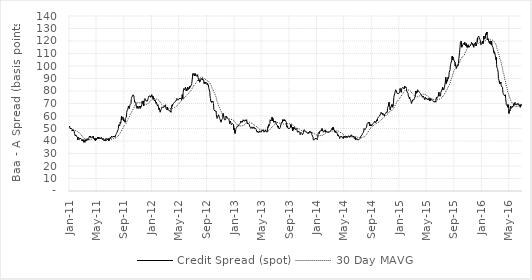
| Category | Credit Spread (spot) |  30 Day MAVG  |
|---|---|---|
| 2016-06-30 | 68 | 68.903 |
| 2016-06-29 | 69 | 68.903 |
| 2016-06-28 | 69 | 68.839 |
| 2016-06-27 | 69 | 68.742 |
| 2016-06-24 | 69 | 68.645 |
| 2016-06-23 | 67 | 68.613 |
| 2016-06-22 | 68 | 68.613 |
| 2016-06-21 | 69 | 68.484 |
| 2016-06-20 | 68 | 68.355 |
| 2016-06-17 | 69 | 68.226 |
| 2016-06-16 | 69 | 68 |
| 2016-06-15 | 69 | 67.839 |
| 2016-06-14 | 70 | 67.839 |
| 2016-06-13 | 69 | 67.742 |
| 2016-06-10 | 69 | 67.742 |
| 2016-06-09 | 70 | 67.71 |
| 2016-06-08 | 70 | 67.645 |
| 2016-06-07 | 69 | 67.581 |
| 2016-06-06 | 69 | 67.581 |
| 2016-06-03 | 69 | 67.645 |
| 2016-06-02 | 69 | 67.71 |
| 2016-06-01 | 70 | 67.871 |
| 2016-05-31 | 71 | 68.097 |
| 2016-05-27 | 69 | 68.258 |
| 2016-05-26 | 70 | 68.484 |
| 2016-05-25 | 69 | 68.677 |
| 2016-05-24 | 69 | 68.903 |
| 2016-05-23 | 68 | 69.129 |
| 2016-05-20 | 67 | 69.452 |
| 2016-05-19 | 68 | 69.839 |
| 2016-05-18 | 68 | 70.258 |
| 2016-05-17 | 68 | 70.742 |
| 2016-05-16 | 67 | 71.226 |
| 2016-05-13 | 66 | 71.742 |
| 2016-05-12 | 66 | 72.323 |
| 2016-05-11 | 68 | 72.935 |
| 2016-05-10 | 67 | 73.548 |
| 2016-05-09 | 64 | 74.161 |
| 2016-05-06 | 65 | 74.903 |
| 2016-05-05 | 64 | 75.581 |
| 2016-05-04 | 62 | 76.355 |
| 2016-05-03 | 64 | 77.194 |
| 2016-05-02 | 69 | 78.032 |
| 2016-04-29 | 67 | 78.871 |
| 2016-04-28 | 69 | 79.806 |
| 2016-04-27 | 68 | 80.71 |
| 2016-04-26 | 68 | 81.677 |
| 2016-04-25 | 68 | 82.677 |
| 2016-04-22 | 69 | 83.742 |
| 2016-04-21 | 71 | 84.968 |
| 2016-04-20 | 71 | 86.065 |
| 2016-04-19 | 74 | 87.194 |
| 2016-04-18 | 77 | 88.29 |
| 2016-04-15 | 76 | 89.355 |
| 2016-04-14 | 76 | 90.452 |
| 2016-04-13 | 76 | 91.581 |
| 2016-04-12 | 76 | 92.677 |
| 2016-04-11 | 76 | 93.774 |
| 2016-04-08 | 78 | 94.968 |
| 2016-04-07 | 79 | 96.097 |
| 2016-04-06 | 81 | 97.258 |
| 2016-04-05 | 83 | 98.355 |
| 2016-04-04 | 83 | 99.419 |
| 2016-04-01 | 83 | 100.548 |
| 2016-03-31 | 84 | 101.742 |
| 2016-03-30 | 85 | 102.806 |
| 2016-03-29 | 87 | 103.839 |
| 2016-03-28 | 86 | 104.871 |
| 2016-03-24 | 87 | 105.968 |
| 2016-03-23 | 86 | 106.968 |
| 2016-03-22 | 88 | 108 |
| 2016-03-21 | 88 | 109 |
| 2016-03-18 | 90 | 110.032 |
| 2016-03-17 | 95 | 111 |
| 2016-03-16 | 96 | 111.806 |
| 2016-03-15 | 97 | 112.645 |
| 2016-03-14 | 98 | 113.419 |
| 2016-03-11 | 99 | 114.355 |
| 2016-03-10 | 101 | 115.226 |
| 2016-03-09 | 107 | 116.065 |
| 2016-03-08 | 105 | 116.645 |
| 2016-03-07 | 106 | 117.323 |
| 2016-03-04 | 108 | 117.903 |
| 2016-03-03 | 110 | 118.355 |
| 2016-03-02 | 110 | 118.742 |
| 2016-03-01 | 111 | 119.129 |
| 2016-02-29 | 110 | 119.548 |
| 2016-02-26 | 110 | 119.903 |
| 2016-02-25 | 113 | 120.194 |
| 2016-02-24 | 113 | 120.355 |
| 2016-02-23 | 115 | 120.581 |
| 2016-02-22 | 115 | 120.742 |
| 2016-02-19 | 116 | 120.839 |
| 2016-02-18 | 118 | 120.903 |
| 2016-02-17 | 120 | 120.903 |
| 2016-02-16 | 117 | 120.806 |
| 2016-02-12 | 117 | 120.871 |
| 2016-02-11 | 119 | 120.968 |
| 2016-02-10 | 120 | 121.032 |
| 2016-02-09 | 118 | 121.065 |
| 2016-02-08 | 118 | 121.226 |
| 2016-02-05 | 119 | 121.419 |
| 2016-02-04 | 120 | 121.581 |
| 2016-02-03 | 120 | 121.677 |
| 2016-02-02 | 120 | 121.71 |
| 2016-02-01 | 122 | 121.774 |
| 2016-01-29 | 121 | 121.677 |
| 2016-01-28 | 127 | 121.613 |
| 2016-01-27 | 126 | 121.355 |
| 2016-01-26 | 127 | 121.032 |
| 2016-01-25 | 125 | 120.71 |
| 2016-01-22 | 126 | 120.516 |
| 2016-01-21 | 124 | 120.258 |
| 2016-01-20 | 122 | 120.032 |
| 2016-01-19 | 122 | 119.903 |
| 2016-01-15 | 122 | 119.774 |
| 2016-01-14 | 124 | 119.613 |
| 2016-01-13 | 121 | 119.323 |
| 2016-01-12 | 119 | 119.194 |
| 2016-01-11 | 118 | 119.161 |
| 2016-01-08 | 120 | 119.129 |
| 2016-01-07 | 120 | 119.032 |
| 2016-01-06 | 118 | 119 |
| 2016-01-05 | 118 | 119 |
| 2016-01-04 | 118 | 119 |
| 2015-12-31 | 117 | 118.968 |
| 2015-12-30 | 119 | 118.968 |
| 2015-12-29 | 120 | 118.871 |
| 2015-12-28 | 121 | 118.742 |
| 2015-12-24 | 121 | 118.581 |
| 2015-12-23 | 123 | 118.387 |
| 2015-12-22 | 124 | 118.161 |
| 2015-12-21 | 124 | 117.935 |
| 2015-12-18 | 123 | 117.677 |
| 2015-12-17 | 121 | 117.419 |
| 2015-12-16 | 122 | 117.258 |
| 2015-12-15 | 119 | 117.032 |
| 2015-12-14 | 119 | 116.968 |
| 2015-12-11 | 119 | 116.935 |
| 2015-12-10 | 116 | 116.903 |
| 2015-12-09 | 117 | 116.903 |
| 2015-12-08 | 119 | 116.903 |
| 2015-12-07 | 118 | 116.839 |
| 2015-12-04 | 117 | 116.871 |
| 2015-12-03 | 118 | 116.871 |
| 2015-12-02 | 118 | 116.871 |
| 2015-12-01 | 117 | 116.871 |
| 2015-11-30 | 115 | 116.903 |
| 2015-11-27 | 117 | 117 |
| 2015-11-25 | 118 | 117 |
| 2015-11-24 | 117 | 116.935 |
| 2015-11-23 | 117 | 116.871 |
| 2015-11-20 | 119 | 116.806 |
| 2015-11-19 | 118 | 116.806 |
| 2015-11-18 | 118 | 116.871 |
| 2015-11-17 | 117 | 116.903 |
| 2015-11-16 | 117 | 116.968 |
| 2015-11-13 | 116 | 116.903 |
| 2015-11-12 | 116 | 116.806 |
| 2015-11-10 | 116 | 116.645 |
| 2015-11-09 | 115 | 116.323 |
| 2015-11-06 | 116 | 115.968 |
| 2015-11-05 | 117 | 115.516 |
| 2015-11-04 | 116 | 115 |
| 2015-11-03 | 115 | 114.484 |
| 2015-11-02 | 116 | 114.032 |
| 2015-10-30 | 115 | 113.516 |
| 2015-10-29 | 117 | 113.032 |
| 2015-10-28 | 118 | 112.484 |
| 2015-10-27 | 118 | 111.839 |
| 2015-10-26 | 116 | 111.258 |
| 2015-10-23 | 117 | 110.774 |
| 2015-10-22 | 117 | 110.226 |
| 2015-10-21 | 119 | 109.774 |
| 2015-10-20 | 117 | 109.29 |
| 2015-10-19 | 118 | 108.871 |
| 2015-10-16 | 118 | 108.419 |
| 2015-10-15 | 118 | 108.032 |
| 2015-10-14 | 118 | 107.677 |
| 2015-10-13 | 117 | 107.258 |
| 2015-10-09 | 116 | 106.968 |
| 2015-10-08 | 115 | 106.71 |
| 2015-10-07 | 115 | 106.419 |
| 2015-10-06 | 119 | 106.065 |
| 2015-10-05 | 120 | 105.581 |
| 2015-10-02 | 119 | 105 |
| 2015-10-01 | 119 | 104.419 |
| 2015-09-30 | 115 | 103.806 |
| 2015-09-29 | 113 | 103.226 |
| 2015-09-28 | 111 | 102.71 |
| 2015-09-25 | 106 | 102.194 |
| 2015-09-24 | 104 | 101.742 |
| 2015-09-23 | 102 | 101.355 |
| 2015-09-22 | 101 | 100.968 |
| 2015-09-21 | 100 | 100.645 |
| 2015-09-18 | 101 | 100.258 |
| 2015-09-17 | 100 | 99.871 |
| 2015-09-16 | 100 | 99.516 |
| 2015-09-15 | 100 | 99.161 |
| 2015-09-14 | 98 | 98.71 |
| 2015-09-11 | 100 | 98.419 |
| 2015-09-10 | 101 | 98.129 |
| 2015-09-09 | 100 | 97.806 |
| 2015-09-08 | 103 | 97.387 |
| 2015-09-04 | 104 | 96.774 |
| 2015-09-03 | 104 | 96.097 |
| 2015-09-02 | 104 | 95.387 |
| 2015-09-01 | 106 | 94.677 |
| 2015-08-31 | 107 | 93.871 |
| 2015-08-28 | 105 | 93.065 |
| 2015-08-27 | 108 | 92.29 |
| 2015-08-26 | 108 | 91.484 |
| 2015-08-25 | 106 | 90.645 |
| 2015-08-24 | 104 | 89.871 |
| 2015-08-21 | 104 | 89.097 |
| 2015-08-20 | 102 | 88.323 |
| 2015-08-19 | 101 | 87.613 |
| 2015-08-18 | 100 | 86.903 |
| 2015-08-17 | 97 | 86.129 |
| 2015-08-14 | 97 | 85.452 |
| 2015-08-13 | 95 | 84.774 |
| 2015-08-12 | 92 | 84.194 |
| 2015-08-11 | 92 | 83.774 |
| 2015-08-10 | 90 | 83.258 |
| 2015-08-07 | 91 | 82.806 |
| 2015-08-06 | 88 | 82.323 |
| 2015-08-05 | 89 | 81.935 |
| 2015-08-04 | 89 | 81.484 |
| 2015-08-03 | 89 | 81 |
| 2015-07-31 | 86 | 80.548 |
| 2015-07-30 | 89 | 80.161 |
| 2015-07-29 | 91 | 79.645 |
| 2015-07-28 | 91 | 79 |
| 2015-07-27 | 87 | 78.387 |
| 2015-07-24 | 84 | 77.903 |
| 2015-07-23 | 83 | 77.516 |
| 2015-07-22 | 82 | 77.161 |
| 2015-07-21 | 82 | 76.806 |
| 2015-07-20 | 81 | 76.452 |
| 2015-07-17 | 82 | 76.161 |
| 2015-07-16 | 81 | 75.839 |
| 2015-07-15 | 83 | 75.548 |
| 2015-07-14 | 82 | 75.194 |
| 2015-07-13 | 82 | 74.903 |
| 2015-07-10 | 80 | 74.613 |
| 2015-07-09 | 80 | 74.387 |
| 2015-07-08 | 80 | 74.161 |
| 2015-07-07 | 79 | 73.935 |
| 2015-07-06 | 76 | 73.774 |
| 2015-07-02 | 76 | 73.645 |
| 2015-07-01 | 76 | 73.581 |
| 2015-06-30 | 77 | 73.516 |
| 2015-06-29 | 79 | 73.419 |
| 2015-06-26 | 76 | 73.226 |
| 2015-06-25 | 76 | 73.161 |
| 2015-06-24 | 76 | 73.097 |
| 2015-06-23 | 76 | 73.032 |
| 2015-06-22 | 75 | 72.935 |
| 2015-06-19 | 74 | 72.903 |
| 2015-06-18 | 75 | 72.903 |
| 2015-06-17 | 74 | 72.871 |
| 2015-06-16 | 73 | 72.871 |
| 2015-06-15 | 71 | 72.903 |
| 2015-06-12 | 72 | 73 |
| 2015-06-11 | 72 | 73.097 |
| 2015-06-10 | 72 | 73.161 |
| 2015-06-09 | 72 | 73.194 |
| 2015-06-08 | 71 | 73.226 |
| 2015-06-05 | 71 | 73.29 |
| 2015-06-04 | 72 | 73.419 |
| 2015-06-03 | 72 | 73.516 |
| 2015-06-02 | 72 | 73.645 |
| 2015-06-01 | 72 | 73.774 |
| 2015-05-29 | 73 | 73.871 |
| 2015-05-28 | 73 | 73.968 |
| 2015-05-27 | 73 | 74.065 |
| 2015-05-26 | 73 | 74.161 |
| 2015-05-22 | 73 | 74.29 |
| 2015-05-21 | 74 | 74.419 |
| 2015-05-20 | 72 | 74.548 |
| 2015-05-19 | 74 | 74.742 |
| 2015-05-18 | 74 | 74.871 |
| 2015-05-15 | 74 | 75.032 |
| 2015-05-14 | 73 | 75.194 |
| 2015-05-13 | 74 | 75.387 |
| 2015-05-12 | 74 | 75.548 |
| 2015-05-11 | 74 | 75.742 |
| 2015-05-08 | 73 | 75.935 |
| 2015-05-07 | 74 | 76.194 |
| 2015-05-06 | 74 | 76.355 |
| 2015-05-05 | 74 | 76.548 |
| 2015-05-04 | 74 | 76.742 |
| 2015-05-01 | 74 | 76.871 |
| 2015-04-30 | 74 | 77.032 |
| 2015-04-29 | 75 | 77.226 |
| 2015-04-28 | 74 | 77.355 |
| 2015-04-27 | 73 | 77.419 |
| 2015-04-24 | 73 | 77.516 |
| 2015-04-23 | 73 | 77.548 |
| 2015-04-22 | 75 | 77.581 |
| 2015-04-21 | 75 | 77.516 |
| 2015-04-20 | 76 | 77.452 |
| 2015-04-17 | 76 | 77.355 |
| 2015-04-16 | 75 | 77.258 |
| 2015-04-15 | 76 | 77.194 |
| 2015-04-14 | 76 | 77.097 |
| 2015-04-13 | 76 | 77 |
| 2015-04-10 | 77 | 76.806 |
| 2015-04-09 | 77 | 76.613 |
| 2015-04-08 | 78 | 76.452 |
| 2015-04-07 | 78 | 76.258 |
| 2015-04-06 | 78 | 76.097 |
| 2015-04-03 | 79 | 75.968 |
| 2015-04-02 | 79 | 75.839 |
| 2015-04-01 | 79 | 75.677 |
| 2015-03-31 | 79 | 75.548 |
| 2015-03-30 | 80 | 75.452 |
| 2015-03-27 | 80 | 75.387 |
| 2015-03-26 | 81 | 75.323 |
| 2015-03-25 | 79 | 75.226 |
| 2015-03-24 | 80 | 75.226 |
| 2015-03-23 | 80 | 75.226 |
| 2015-03-20 | 78 | 75.29 |
| 2015-03-19 | 79 | 75.452 |
| 2015-03-18 | 80 | 75.581 |
| 2015-03-17 | 79 | 75.677 |
| 2015-03-16 | 76 | 75.806 |
| 2015-03-13 | 76 | 76.032 |
| 2015-03-12 | 74 | 76.29 |
| 2015-03-11 | 74 | 76.548 |
| 2015-03-10 | 73 | 76.806 |
| 2015-03-09 | 73 | 77.097 |
| 2015-03-06 | 73 | 77.387 |
| 2015-03-05 | 73 | 77.677 |
| 2015-03-04 | 73 | 78 |
| 2015-03-03 | 73 | 78.323 |
| 2015-03-02 | 73 | 78.613 |
| 2015-02-27 | 70 | 78.839 |
| 2015-02-26 | 71 | 79.129 |
| 2015-02-25 | 72 | 79.419 |
| 2015-02-24 | 72 | 79.71 |
| 2015-02-23 | 73 | 80.032 |
| 2015-02-20 | 74 | 80.29 |
| 2015-02-19 | 75 | 80.452 |
| 2015-02-18 | 74 | 80.581 |
| 2015-02-17 | 75 | 80.71 |
| 2015-02-13 | 76 | 80.806 |
| 2015-02-12 | 78 | 80.871 |
| 2015-02-11 | 78 | 80.871 |
| 2015-02-10 | 78 | 80.871 |
| 2015-02-09 | 79 | 80.871 |
| 2015-02-06 | 80 | 80.839 |
| 2015-02-05 | 82 | 80.839 |
| 2015-02-04 | 83 | 80.806 |
| 2015-02-03 | 83 | 80.742 |
| 2015-02-02 | 83 | 80.677 |
| 2015-01-30 | 83 | 80.613 |
| 2015-01-29 | 83 | 80.452 |
| 2015-01-28 | 84 | 80.226 |
| 2015-01-27 | 82 | 79.935 |
| 2015-01-26 | 82 | 79.613 |
| 2015-01-23 | 82 | 79.226 |
| 2015-01-22 | 82 | 78.774 |
| 2015-01-21 | 82 | 78.29 |
| 2015-01-20 | 83 | 77.871 |
| 2015-01-16 | 83 | 77.387 |
| 2015-01-15 | 82 | 76.935 |
| 2015-01-14 | 80 | 76.484 |
| 2015-01-13 | 79 | 76.065 |
| 2015-01-12 | 80 | 75.645 |
| 2015-01-09 | 81 | 75.161 |
| 2015-01-08 | 82 | 74.71 |
| 2015-01-07 | 81 | 74.29 |
| 2015-01-06 | 79 | 73.968 |
| 2015-01-05 | 79 | 73.71 |
| 2015-01-02 | 78 | 73.452 |
| 2014-12-31 | 78 | 73.129 |
| 2014-12-30 | 78 | 72.774 |
| 2014-12-29 | 78 | 72.387 |
| 2014-12-26 | 78 | 71.903 |
| 2014-12-24 | 78 | 71.419 |
| 2014-12-23 | 78 | 70.935 |
| 2014-12-22 | 80 | 70.452 |
| 2014-12-19 | 81 | 69.903 |
| 2014-12-18 | 81 | 69.29 |
| 2014-12-17 | 81 | 68.677 |
| 2014-12-16 | 81 | 68.065 |
| 2014-12-15 | 78 | 67.419 |
| 2014-12-12 | 76 | 66.839 |
| 2014-12-11 | 75 | 66.355 |
| 2014-12-10 | 72 | 65.903 |
| 2014-12-09 | 70 | 65.548 |
| 2014-12-08 | 68 | 65.29 |
| 2014-12-05 | 67 | 65.065 |
| 2014-12-04 | 69 | 64.903 |
| 2014-12-03 | 68 | 64.677 |
| 2014-12-02 | 69 | 64.484 |
| 2014-12-01 | 68 | 64.258 |
| 2014-11-28 | 67 | 64.097 |
| 2014-11-26 | 66 | 63.968 |
| 2014-11-25 | 65 | 63.839 |
| 2014-11-24 | 67 | 63.742 |
| 2014-11-21 | 69 | 63.516 |
| 2014-11-20 | 71 | 63.226 |
| 2014-11-19 | 71 | 62.871 |
| 2014-11-18 | 71 | 62.516 |
| 2014-11-17 | 68 | 62.129 |
| 2014-11-14 | 67 | 61.839 |
| 2014-11-13 | 66 | 61.581 |
| 2014-11-12 | 63 | 61.323 |
| 2014-11-11 | 63 | 61.097 |
| 2014-11-10 | 63 | 60.903 |
| 2014-11-07 | 63 | 60.677 |
| 2014-11-06 | 63 | 60.452 |
| 2014-11-05 | 62 | 60.194 |
| 2014-11-04 | 62 | 59.968 |
| 2014-11-03 | 62 | 59.742 |
| 2014-10-31 | 61 | 59.516 |
| 2014-10-30 | 60 | 59.355 |
| 2014-10-29 | 61 | 59.226 |
| 2014-10-28 | 61 | 59.032 |
| 2014-10-27 | 61 | 58.839 |
| 2014-10-24 | 62 | 58.613 |
| 2014-10-23 | 61 | 58.355 |
| 2014-10-22 | 62 | 58.129 |
| 2014-10-21 | 62 | 57.871 |
| 2014-10-20 | 62 | 57.581 |
| 2014-10-17 | 62 | 57.258 |
| 2014-10-16 | 63 | 56.935 |
| 2014-10-15 | 63 | 56.613 |
| 2014-10-14 | 62 | 56.258 |
| 2014-10-10 | 62 | 55.968 |
| 2014-10-09 | 60 | 55.645 |
| 2014-10-08 | 60 | 55.452 |
| 2014-10-07 | 60 | 55.29 |
| 2014-10-06 | 60 | 55.097 |
| 2014-10-03 | 59 | 54.903 |
| 2014-10-02 | 59 | 54.774 |
| 2014-10-01 | 59 | 54.645 |
| 2014-09-30 | 58 | 54.516 |
| 2014-09-29 | 56 | 54.387 |
| 2014-09-26 | 57 | 54.29 |
| 2014-09-25 | 56 | 54.129 |
| 2014-09-24 | 56 | 53.968 |
| 2014-09-23 | 55 | 53.806 |
| 2014-09-22 | 55 | 53.677 |
| 2014-09-19 | 55 | 53.516 |
| 2014-09-18 | 55 | 53.355 |
| 2014-09-17 | 56 | 53.161 |
| 2014-09-16 | 56 | 52.935 |
| 2014-09-15 | 55 | 52.742 |
| 2014-09-12 | 55 | 52.516 |
| 2014-09-11 | 54 | 52.258 |
| 2014-09-10 | 54 | 52.032 |
| 2014-09-09 | 54 | 51.806 |
| 2014-09-08 | 54 | 51.548 |
| 2014-09-05 | 53 | 51.258 |
| 2014-09-04 | 52 | 51 |
| 2014-09-03 | 52 | 50.774 |
| 2014-09-02 | 53 | 50.548 |
| 2014-08-29 | 52 | 50.258 |
| 2014-08-28 | 53 | 49.968 |
| 2014-08-27 | 52 | 49.645 |
| 2014-08-26 | 54 | 49.355 |
| 2014-08-25 | 55 | 48.968 |
| 2014-08-22 | 54 | 48.548 |
| 2014-08-21 | 54 | 48.161 |
| 2014-08-20 | 55 | 47.742 |
| 2014-08-19 | 55 | 47.29 |
| 2014-08-18 | 55 | 46.839 |
| 2014-08-15 | 54 | 46.387 |
| 2014-08-14 | 53 | 45.968 |
| 2014-08-13 | 52 | 45.581 |
| 2014-08-12 | 51 | 45.258 |
| 2014-08-11 | 51 | 44.968 |
| 2014-08-08 | 51 | 44.645 |
| 2014-08-07 | 50 | 44.355 |
| 2014-08-06 | 50 | 44.065 |
| 2014-08-05 | 49 | 43.839 |
| 2014-08-04 | 49 | 43.645 |
| 2014-08-01 | 50 | 43.419 |
| 2014-07-31 | 48 | 43.194 |
| 2014-07-30 | 47 | 43.065 |
| 2014-07-29 | 47 | 42.968 |
| 2014-07-28 | 47 | 42.839 |
| 2014-07-25 | 46 | 42.742 |
| 2014-07-24 | 45 | 42.677 |
| 2014-07-23 | 45 | 42.645 |
| 2014-07-22 | 45 | 42.613 |
| 2014-07-21 | 45 | 42.581 |
| 2014-07-18 | 44 | 42.581 |
| 2014-07-17 | 43 | 42.613 |
| 2014-07-16 | 43 | 42.645 |
| 2014-07-15 | 43 | 42.677 |
| 2014-07-14 | 42 | 42.677 |
| 2014-07-11 | 42 | 42.71 |
| 2014-07-10 | 42 | 42.742 |
| 2014-07-09 | 41 | 42.806 |
| 2014-07-08 | 41 | 42.903 |
| 2014-07-07 | 41 | 43 |
| 2014-07-03 | 41 | 43.065 |
| 2014-07-02 | 41 | 43.129 |
| 2014-07-01 | 41 | 43.194 |
| 2014-06-30 | 42 | 43.258 |
| 2014-06-27 | 42 | 43.323 |
| 2014-06-26 | 41 | 43.355 |
| 2014-06-25 | 42 | 43.419 |
| 2014-06-24 | 41 | 43.452 |
| 2014-06-23 | 43 | 43.516 |
| 2014-06-20 | 43 | 43.516 |
| 2014-06-19 | 42 | 43.548 |
| 2014-06-18 | 43 | 43.581 |
| 2014-06-17 | 44 | 43.613 |
| 2014-06-16 | 44 | 43.581 |
| 2014-06-13 | 43 | 43.516 |
| 2014-06-12 | 44 | 43.516 |
| 2014-06-11 | 44 | 43.484 |
| 2014-06-10 | 44 | 43.452 |
| 2014-06-09 | 44 | 43.419 |
| 2014-06-06 | 44 | 43.387 |
| 2014-06-05 | 45 | 43.355 |
| 2014-06-04 | 45 | 43.29 |
| 2014-06-03 | 44 | 43.258 |
| 2014-06-02 | 44 | 43.226 |
| 2014-05-30 | 43 | 43.194 |
| 2014-05-29 | 43 | 43.161 |
| 2014-05-28 | 43 | 43.161 |
| 2014-05-27 | 44 | 43.194 |
| 2014-05-23 | 44 | 43.194 |
| 2014-05-22 | 44 | 43.226 |
| 2014-05-21 | 43 | 43.226 |
| 2014-05-20 | 43 | 43.258 |
| 2014-05-19 | 43 | 43.355 |
| 2014-05-16 | 43 | 43.484 |
| 2014-05-15 | 44 | 43.613 |
| 2014-05-14 | 43 | 43.71 |
| 2014-05-13 | 43 | 43.839 |
| 2014-05-12 | 43 | 43.968 |
| 2014-05-09 | 43 | 44.129 |
| 2014-05-08 | 43 | 44.258 |
| 2014-05-07 | 44 | 44.419 |
| 2014-05-06 | 43 | 44.548 |
| 2014-05-05 | 44 | 44.742 |
| 2014-05-02 | 43 | 44.903 |
| 2014-05-01 | 42 | 45.129 |
| 2014-04-30 | 43 | 45.355 |
| 2014-04-29 | 43 | 45.613 |
| 2014-04-28 | 43 | 45.806 |
| 2014-04-25 | 43 | 46 |
| 2014-04-24 | 43 | 46.194 |
| 2014-04-23 | 43 | 46.419 |
| 2014-04-22 | 43 | 46.613 |
| 2014-04-21 | 44 | 46.806 |
| 2014-04-17 | 43 | 46.968 |
| 2014-04-16 | 43 | 47.129 |
| 2014-04-15 | 42 | 47.29 |
| 2014-04-14 | 43 | 47.484 |
| 2014-04-11 | 44 | 47.613 |
| 2014-04-10 | 44 | 47.71 |
| 2014-04-09 | 45 | 47.806 |
| 2014-04-08 | 44 | 47.871 |
| 2014-04-07 | 44 | 47.968 |
| 2014-04-04 | 46 | 48.065 |
| 2014-04-03 | 47 | 48.097 |
| 2014-04-02 | 47 | 48.097 |
| 2014-04-01 | 47 | 48.097 |
| 2014-03-31 | 47 | 48.129 |
| 2014-03-28 | 47 | 48.129 |
| 2014-03-27 | 48 | 48.129 |
| 2014-03-26 | 47 | 48.129 |
| 2014-03-25 | 48 | 48.194 |
| 2014-03-24 | 48 | 48.194 |
| 2014-03-21 | 49 | 48.194 |
| 2014-03-20 | 49 | 48.161 |
| 2014-03-19 | 50 | 48.129 |
| 2014-03-18 | 49 | 48.032 |
| 2014-03-17 | 51 | 48 |
| 2014-03-14 | 49 | 47.903 |
| 2014-03-13 | 49 | 47.903 |
| 2014-03-12 | 49 | 47.871 |
| 2014-03-11 | 50 | 47.903 |
| 2014-03-10 | 49 | 47.871 |
| 2014-03-07 | 49 | 47.839 |
| 2014-03-06 | 49 | 47.806 |
| 2014-03-05 | 48 | 47.774 |
| 2014-03-04 | 48 | 47.774 |
| 2014-03-03 | 48 | 47.742 |
| 2014-02-28 | 47 | 47.677 |
| 2014-02-27 | 47 | 47.677 |
| 2014-02-26 | 47 | 47.677 |
| 2014-02-25 | 47 | 47.645 |
| 2014-02-24 | 47 | 47.581 |
| 2014-02-21 | 47 | 47.452 |
| 2014-02-20 | 47 | 47.29 |
| 2014-02-19 | 47 | 47.097 |
| 2014-02-18 | 47 | 46.935 |
| 2014-02-14 | 48 | 46.774 |
| 2014-02-13 | 47 | 46.581 |
| 2014-02-12 | 47 | 46.419 |
| 2014-02-11 | 48 | 46.258 |
| 2014-02-10 | 49 | 46.065 |
| 2014-02-07 | 48 | 45.806 |
| 2014-02-06 | 48 | 45.581 |
| 2014-02-05 | 48 | 45.355 |
| 2014-02-04 | 48 | 45.129 |
| 2014-02-03 | 47 | 44.968 |
| 2014-01-31 | 48 | 44.839 |
| 2014-01-30 | 48 | 44.71 |
| 2014-01-29 | 49 | 44.613 |
| 2014-01-28 | 48 | 44.548 |
| 2014-01-27 | 50 | 44.516 |
| 2014-01-24 | 49 | 44.419 |
| 2014-01-23 | 48 | 44.355 |
| 2014-01-22 | 48 | 44.323 |
| 2014-01-21 | 48 | 44.29 |
| 2014-01-17 | 48 | 44.29 |
| 2014-01-16 | 47 | 44.258 |
| 2014-01-15 | 46 | 44.258 |
| 2014-01-14 | 47 | 44.258 |
| 2014-01-13 | 47 | 44.258 |
| 2014-01-10 | 46 | 44.258 |
| 2014-01-09 | 45 | 44.258 |
| 2014-01-08 | 43 | 44.29 |
| 2014-01-07 | 42 | 44.387 |
| 2014-01-06 | 41 | 44.548 |
| 2014-01-03 | 42 | 44.742 |
| 2014-01-02 | 42 | 44.903 |
| 2013-12-31 | 42 | 45.097 |
| 2013-12-30 | 42 | 45.29 |
| 2013-12-27 | 42 | 45.484 |
| 2013-12-26 | 42 | 45.677 |
| 2013-12-24 | 41 | 45.903 |
| 2013-12-23 | 41 | 46.129 |
| 2013-12-20 | 41 | 46.323 |
| 2013-12-19 | 41 | 46.484 |
| 2013-12-18 | 43 | 46.645 |
| 2013-12-17 | 43 | 46.71 |
| 2013-12-16 | 44 | 46.774 |
| 2013-12-13 | 45 | 46.839 |
| 2013-12-12 | 47 | 46.871 |
| 2013-12-11 | 47 | 46.839 |
| 2013-12-10 | 47 | 46.839 |
| 2013-12-09 | 47 | 46.806 |
| 2013-12-06 | 47 | 46.774 |
| 2013-12-05 | 47 | 46.71 |
| 2013-12-04 | 48 | 46.677 |
| 2013-12-03 | 47 | 46.645 |
| 2013-12-02 | 47 | 46.645 |
| 2013-11-29 | 46 | 46.677 |
| 2013-11-27 | 47 | 46.742 |
| 2013-11-26 | 47 | 46.742 |
| 2013-11-25 | 46 | 46.742 |
| 2013-11-22 | 46 | 46.806 |
| 2013-11-21 | 46 | 46.903 |
| 2013-11-20 | 47 | 47.032 |
| 2013-11-19 | 47 | 47.129 |
| 2013-11-18 | 47 | 47.226 |
| 2013-11-15 | 48 | 47.29 |
| 2013-11-14 | 48 | 47.355 |
| 2013-11-13 | 48 | 47.419 |
| 2013-11-12 | 48 | 47.484 |
| 2013-11-08 | 49 | 47.548 |
| 2013-11-07 | 48 | 47.613 |
| 2013-11-06 | 47 | 47.677 |
| 2013-11-05 | 46 | 47.742 |
| 2013-11-04 | 46 | 47.903 |
| 2013-11-01 | 45 | 47.968 |
| 2013-10-31 | 45 | 48.097 |
| 2013-10-30 | 46 | 48.258 |
| 2013-10-29 | 46 | 48.387 |
| 2013-10-28 | 46 | 48.581 |
| 2013-10-25 | 47 | 48.806 |
| 2013-10-24 | 46 | 48.968 |
| 2013-10-23 | 46 | 49.194 |
| 2013-10-22 | 45 | 49.355 |
| 2013-10-21 | 46 | 49.548 |
| 2013-10-18 | 47 | 49.677 |
| 2013-10-17 | 47 | 49.774 |
| 2013-10-16 | 48 | 49.871 |
| 2013-10-15 | 48 | 49.935 |
| 2013-10-11 | 47 | 50 |
| 2013-10-10 | 47 | 50.129 |
| 2013-10-09 | 48 | 50.29 |
| 2013-10-08 | 49 | 50.387 |
| 2013-10-07 | 50 | 50.516 |
| 2013-10-04 | 50 | 50.677 |
| 2013-10-03 | 50 | 50.839 |
| 2013-10-02 | 49 | 51 |
| 2013-10-01 | 50 | 51.226 |
| 2013-09-30 | 50 | 51.419 |
| 2013-09-27 | 50 | 51.645 |
| 2013-09-26 | 50 | 51.839 |
| 2013-09-25 | 51 | 52.065 |
| 2013-09-24 | 50 | 52.226 |
| 2013-09-23 | 49 | 52.419 |
| 2013-09-20 | 51 | 52.677 |
| 2013-09-19 | 48 | 52.839 |
| 2013-09-18 | 49 | 53.129 |
| 2013-09-17 | 50 | 53.323 |
| 2013-09-16 | 50 | 53.484 |
| 2013-09-13 | 52 | 53.645 |
| 2013-09-12 | 53 | 53.742 |
| 2013-09-11 | 52 | 53.774 |
| 2013-09-10 | 53 | 53.839 |
| 2013-09-09 | 51 | 53.774 |
| 2013-09-06 | 51 | 53.774 |
| 2013-09-05 | 50 | 53.742 |
| 2013-09-04 | 50 | 53.742 |
| 2013-09-03 | 50 | 53.742 |
| 2013-08-30 | 50 | 53.742 |
| 2013-08-29 | 50 | 53.774 |
| 2013-08-28 | 51 | 53.839 |
| 2013-08-27 | 52 | 53.839 |
| 2013-08-26 | 51 | 53.839 |
| 2013-08-23 | 53 | 53.871 |
| 2013-08-22 | 55 | 53.839 |
| 2013-08-21 | 55 | 53.774 |
| 2013-08-20 | 55 | 53.71 |
| 2013-08-19 | 56 | 53.677 |
| 2013-08-16 | 56 | 53.677 |
| 2013-08-15 | 57 | 53.677 |
| 2013-08-14 | 56 | 53.613 |
| 2013-08-13 | 57 | 53.613 |
| 2013-08-12 | 56 | 53.581 |
| 2013-08-09 | 56 | 53.548 |
| 2013-08-08 | 57 | 53.516 |
| 2013-08-07 | 56 | 53.516 |
| 2013-08-06 | 57 | 53.581 |
| 2013-08-05 | 55 | 53.548 |
| 2013-08-02 | 55 | 53.677 |
| 2013-08-01 | 55 | 53.774 |
| 2013-07-31 | 55 | 53.839 |
| 2013-07-30 | 54 | 53.903 |
| 2013-07-29 | 54 | 53.968 |
| 2013-07-26 | 51 | 54.032 |
| 2013-07-25 | 51 | 54.194 |
| 2013-07-24 | 50 | 54.387 |
| 2013-07-23 | 50 | 54.516 |
| 2013-07-22 | 50 | 54.613 |
| 2013-07-19 | 50 | 54.677 |
| 2013-07-18 | 51 | 54.774 |
| 2013-07-17 | 52 | 54.839 |
| 2013-07-16 | 51 | 54.871 |
| 2013-07-15 | 52 | 54.839 |
| 2013-07-12 | 52 | 54.71 |
| 2013-07-11 | 52 | 54.581 |
| 2013-07-10 | 53 | 54.419 |
| 2013-07-09 | 53 | 54.226 |
| 2013-07-08 | 54 | 54.065 |
| 2013-07-05 | 56 | 53.903 |
| 2013-07-03 | 56 | 53.677 |
| 2013-07-02 | 55 | 53.419 |
| 2013-07-01 | 56 | 53.194 |
| 2013-06-28 | 56 | 52.935 |
| 2013-06-27 | 55 | 52.645 |
| 2013-06-26 | 55 | 52.419 |
| 2013-06-25 | 57 | 52.226 |
| 2013-06-24 | 58 | 51.935 |
| 2013-06-21 | 56 | 51.613 |
| 2013-06-20 | 59 | 51.355 |
| 2013-06-19 | 58 | 51.032 |
| 2013-06-18 | 57 | 50.71 |
| 2013-06-17 | 57 | 50.419 |
| 2013-06-14 | 56 | 50.097 |
| 2013-06-13 | 56 | 49.806 |
| 2013-06-12 | 56 | 49.516 |
| 2013-06-11 | 57 | 49.226 |
| 2013-06-10 | 54 | 48.935 |
| 2013-06-07 | 53 | 48.742 |
| 2013-06-06 | 52 | 48.548 |
| 2013-06-05 | 53 | 48.387 |
| 2013-06-04 | 53 | 48.194 |
| 2013-06-03 | 53 | 48 |
| 2013-05-31 | 50 | 47.806 |
| 2013-05-30 | 48 | 47.742 |
| 2013-05-29 | 48 | 47.742 |
| 2013-05-28 | 47 | 47.71 |
| 2013-05-24 | 47 | 47.742 |
| 2013-05-23 | 48 | 47.806 |
| 2013-05-22 | 49 | 47.839 |
| 2013-05-21 | 49 | 47.839 |
| 2013-05-20 | 48 | 47.871 |
| 2013-05-17 | 48 | 47.935 |
| 2013-05-16 | 48 | 48 |
| 2013-05-15 | 47 | 48.065 |
| 2013-05-14 | 48 | 48.194 |
| 2013-05-13 | 49 | 48.29 |
| 2013-05-10 | 48 | 48.355 |
| 2013-05-09 | 48 | 48.419 |
| 2013-05-08 | 48 | 48.484 |
| 2013-05-07 | 49 | 48.581 |
| 2013-05-06 | 48 | 48.645 |
| 2013-05-03 | 48 | 48.742 |
| 2013-05-02 | 47 | 48.839 |
| 2013-05-01 | 47 | 48.968 |
| 2013-04-30 | 47 | 49.065 |
| 2013-04-29 | 47 | 49.194 |
| 2013-04-26 | 48 | 49.323 |
| 2013-04-25 | 48 | 49.419 |
| 2013-04-24 | 47 | 49.548 |
| 2013-04-23 | 47 | 49.742 |
| 2013-04-22 | 47 | 49.968 |
| 2013-04-19 | 47 | 50.194 |
| 2013-04-18 | 47 | 50.419 |
| 2013-04-17 | 48 | 50.645 |
| 2013-04-16 | 48 | 50.839 |
| 2013-04-15 | 47 | 51.032 |
| 2013-04-12 | 48 | 51.258 |
| 2013-04-11 | 49 | 51.548 |
| 2013-04-10 | 49 | 51.806 |
| 2013-04-09 | 49 | 52.032 |
| 2013-04-08 | 50 | 52.258 |
| 2013-04-05 | 50 | 52.484 |
| 2013-04-04 | 50 | 52.677 |
| 2013-04-03 | 50 | 52.871 |
| 2013-04-02 | 51 | 53.065 |
| 2013-04-01 | 51 | 53.226 |
| 2013-03-28 | 51 | 53.387 |
| 2013-03-27 | 50 | 53.581 |
| 2013-03-26 | 50 | 53.806 |
| 2013-03-25 | 51 | 53.968 |
| 2013-03-22 | 51 | 54.129 |
| 2013-03-21 | 51 | 54.29 |
| 2013-03-20 | 51 | 54.419 |
| 2013-03-19 | 51 | 54.548 |
| 2013-03-18 | 50 | 54.71 |
| 2013-03-15 | 51 | 54.871 |
| 2013-03-14 | 51 | 55 |
| 2013-03-13 | 51 | 55.097 |
| 2013-03-12 | 52 | 55.194 |
| 2013-03-11 | 53 | 55.258 |
| 2013-03-08 | 54 | 55.258 |
| 2013-03-07 | 54 | 55.226 |
| 2013-03-06 | 54 | 55.161 |
| 2013-03-05 | 54 | 55.097 |
| 2013-03-04 | 54 | 55.032 |
| 2013-03-01 | 54 | 54.968 |
| 2013-02-28 | 54 | 54.871 |
| 2013-02-27 | 57 | 54.774 |
| 2013-02-26 | 57 | 54.548 |
| 2013-02-25 | 56 | 54.29 |
| 2013-02-22 | 56 | 54.032 |
| 2013-02-21 | 57 | 53.742 |
| 2013-02-20 | 56 | 53.387 |
| 2013-02-19 | 56 | 53.065 |
| 2013-02-15 | 56 | 52.871 |
| 2013-02-14 | 56 | 52.645 |
| 2013-02-13 | 56 | 52.548 |
| 2013-02-12 | 57 | 52.452 |
| 2013-02-11 | 57 | 52.323 |
| 2013-02-08 | 55 | 52.226 |
| 2013-02-07 | 56 | 52.194 |
| 2013-02-06 | 56 | 52.097 |
| 2013-02-05 | 55 | 52.032 |
| 2013-02-04 | 55 | 52.032 |
| 2013-02-01 | 56 | 52.032 |
| 2013-01-31 | 55 | 52.032 |
| 2013-01-30 | 55 | 52 |
| 2013-01-29 | 54 | 52 |
| 2013-01-28 | 54 | 52.065 |
| 2013-01-25 | 54 | 52.161 |
| 2013-01-24 | 53 | 52.258 |
| 2013-01-23 | 53 | 52.419 |
| 2013-01-22 | 52 | 52.581 |
| 2013-01-18 | 52 | 52.774 |
| 2013-01-17 | 52 | 52.968 |
| 2013-01-16 | 52 | 53.161 |
| 2013-01-15 | 51 | 53.387 |
| 2013-01-14 | 51 | 53.677 |
| 2013-01-11 | 50 | 53.935 |
| 2013-01-10 | 49 | 54.194 |
| 2013-01-09 | 48 | 54.452 |
| 2013-01-08 | 47 | 54.742 |
| 2013-01-07 | 46 | 55.065 |
| 2013-01-04 | 46 | 55.452 |
| 2013-01-03 | 50 | 55.871 |
| 2013-01-02 | 49 | 56.194 |
| 2012-12-31 | 53 | 56.613 |
| 2012-12-28 | 53 | 56.839 |
| 2012-12-27 | 53 | 57 |
| 2012-12-26 | 54 | 57.129 |
| 2012-12-24 | 54 | 57.226 |
| 2012-12-21 | 53 | 57.29 |
| 2012-12-20 | 54 | 57.355 |
| 2012-12-19 | 55 | 57.387 |
| 2012-12-18 | 55 | 57.452 |
| 2012-12-17 | 56 | 57.516 |
| 2012-12-14 | 54 | 57.581 |
| 2012-12-13 | 55 | 57.742 |
| 2012-12-12 | 56 | 57.935 |
| 2012-12-11 | 57 | 58.097 |
| 2012-12-10 | 57 | 58.226 |
| 2012-12-07 | 58 | 58.323 |
| 2012-12-06 | 58 | 58.355 |
| 2012-12-05 | 58 | 58.355 |
| 2012-12-04 | 58 | 58.387 |
| 2012-12-03 | 58 | 58.452 |
| 2012-11-30 | 59 | 58.548 |
| 2012-11-29 | 60 | 58.71 |
| 2012-11-28 | 59 | 58.839 |
| 2012-11-27 | 58 | 59 |
| 2012-11-26 | 57 | 59.194 |
| 2012-11-23 | 57 | 59.419 |
| 2012-11-21 | 57 | 59.677 |
| 2012-11-20 | 58 | 60.032 |
| 2012-11-19 | 59 | 60.419 |
| 2012-11-16 | 60 | 60.806 |
| 2012-11-15 | 62 | 61.194 |
| 2012-11-14 | 60 | 61.516 |
| 2012-11-13 | 58 | 61.903 |
| 2012-11-09 | 57 | 62.323 |
| 2012-11-08 | 57 | 62.806 |
| 2012-11-07 | 56 | 63.258 |
| 2012-11-06 | 55 | 63.774 |
| 2012-11-05 | 55 | 64.387 |
| 2012-11-02 | 57 | 65.032 |
| 2012-11-01 | 57 | 65.645 |
| 2012-10-31 | 58 | 66.355 |
| 2012-10-29 | 59 | 67.032 |
| 2012-10-26 | 61 | 67.774 |
| 2012-10-25 | 61 | 68.484 |
| 2012-10-24 | 61 | 69.226 |
| 2012-10-23 | 60 | 70 |
| 2012-10-22 | 59 | 70.839 |
| 2012-10-19 | 58 | 71.677 |
| 2012-10-18 | 59 | 72.581 |
| 2012-10-17 | 60 | 73.452 |
| 2012-10-16 | 61 | 74.323 |
| 2012-10-15 | 64 | 75.129 |
| 2012-10-12 | 64 | 75.839 |
| 2012-10-11 | 64 | 76.581 |
| 2012-10-10 | 64 | 77.29 |
| 2012-10-09 | 64 | 78.032 |
| 2012-10-05 | 65 | 78.742 |
| 2012-10-04 | 68 | 79.452 |
| 2012-10-03 | 70 | 80.129 |
| 2012-10-02 | 71 | 80.742 |
| 2012-10-01 | 72 | 81.323 |
| 2012-09-28 | 72 | 81.871 |
| 2012-09-27 | 72 | 82.452 |
| 2012-09-26 | 71 | 83 |
| 2012-09-25 | 72 | 83.581 |
| 2012-09-24 | 71 | 84.161 |
| 2012-09-21 | 72 | 84.774 |
| 2012-09-20 | 74 | 85.355 |
| 2012-09-19 | 75 | 85.839 |
| 2012-09-18 | 76 | 86.258 |
| 2012-09-17 | 79 | 86.613 |
| 2012-09-14 | 79 | 86.935 |
| 2012-09-13 | 82 | 87.258 |
| 2012-09-12 | 83 | 87.452 |
| 2012-09-11 | 84 | 87.645 |
| 2012-09-10 | 85 | 87.871 |
| 2012-09-07 | 86 | 88.097 |
| 2012-09-06 | 85 | 88.323 |
| 2012-09-05 | 86 | 88.548 |
| 2012-09-04 | 86 | 88.742 |
| 2012-08-31 | 87 | 88.935 |
| 2012-08-30 | 86 | 89.097 |
| 2012-08-29 | 86 | 89.29 |
| 2012-08-28 | 87 | 89.484 |
| 2012-08-27 | 86 | 89.71 |
| 2012-08-24 | 87 | 89.903 |
| 2012-08-23 | 86 | 90.097 |
| 2012-08-22 | 87 | 90.323 |
| 2012-08-21 | 89 | 90.548 |
| 2012-08-20 | 89 | 90.71 |
| 2012-08-17 | 89 | 90.839 |
| 2012-08-16 | 89 | 91 |
| 2012-08-15 | 90 | 91.097 |
| 2012-08-14 | 89 | 91.161 |
| 2012-08-13 | 89 | 91.065 |
| 2012-08-10 | 90 | 90.935 |
| 2012-08-09 | 90 | 90.774 |
| 2012-08-08 | 90 | 90.613 |
| 2012-08-07 | 89 | 90.419 |
| 2012-08-06 | 88 | 90.226 |
| 2012-08-03 | 87 | 90.097 |
| 2012-08-02 | 89 | 89.968 |
| 2012-08-01 | 89 | 89.742 |
| 2012-07-31 | 88 | 89.548 |
| 2012-07-30 | 89 | 89.355 |
| 2012-07-27 | 91 | 89.129 |
| 2012-07-26 | 92 | 88.806 |
| 2012-07-25 | 93 | 88.484 |
| 2012-07-24 | 92 | 88.161 |
| 2012-07-23 | 92 | 87.806 |
| 2012-07-20 | 92 | 87.419 |
| 2012-07-19 | 92 | 87.065 |
| 2012-07-18 | 92 | 86.677 |
| 2012-07-17 | 92 | 86.323 |
| 2012-07-16 | 94 | 86.032 |
| 2012-07-13 | 92 | 85.677 |
| 2012-07-12 | 93 | 85.355 |
| 2012-07-11 | 93 | 84.968 |
| 2012-07-10 | 94 | 84.613 |
| 2012-07-09 | 94 | 84.226 |
| 2012-07-06 | 93 | 83.774 |
| 2012-07-05 | 94 | 83.323 |
| 2012-07-03 | 92 | 82.677 |
| 2012-07-02 | 92 | 82.194 |
| 2012-06-29 | 86 | 81.613 |
| 2012-06-28 | 85 | 81.226 |
| 2012-06-27 | 85 | 80.839 |
| 2012-06-26 | 85 | 80.484 |
| 2012-06-25 | 84 | 80.129 |
| 2012-06-22 | 83 | 79.806 |
| 2012-06-21 | 84 | 79.516 |
| 2012-06-20 | 83 | 79.194 |
| 2012-06-19 | 82 | 78.903 |
| 2012-06-18 | 83 | 78.645 |
| 2012-06-15 | 82 | 78.355 |
| 2012-06-14 | 82 | 78.097 |
| 2012-06-13 | 81 | 77.806 |
| 2012-06-12 | 82 | 77.548 |
| 2012-06-11 | 83 | 77.258 |
| 2012-06-08 | 81 | 76.935 |
| 2012-06-07 | 80 | 76.677 |
| 2012-06-06 | 81 | 76.484 |
| 2012-06-05 | 80 | 76.226 |
| 2012-06-04 | 81 | 75.968 |
| 2012-06-01 | 83 | 75.677 |
| 2012-05-31 | 83 | 75.323 |
| 2012-05-30 | 82 | 74.968 |
| 2012-05-29 | 81 | 74.645 |
| 2012-05-25 | 82 | 74.323 |
| 2012-05-24 | 82 | 73.968 |
| 2012-05-23 | 80 | 73.613 |
| 2012-05-22 | 79 | 73.323 |
| 2012-05-21 | 74 | 73.032 |
| 2012-05-18 | 77 | 72.871 |
| 2012-05-17 | 74 | 72.581 |
| 2012-05-16 | 74 | 72.419 |
| 2012-05-15 | 73 | 72.258 |
| 2012-05-14 | 74 | 72.129 |
| 2012-05-11 | 74 | 71.871 |
| 2012-05-10 | 74 | 71.516 |
| 2012-05-09 | 74 | 71.161 |
| 2012-05-08 | 74 | 70.839 |
| 2012-05-07 | 74 | 70.516 |
| 2012-05-04 | 74 | 70.194 |
| 2012-05-03 | 74 | 69.871 |
| 2012-05-02 | 74 | 69.548 |
| 2012-05-01 | 73 | 69.226 |
| 2012-04-30 | 73 | 68.968 |
| 2012-04-27 | 73 | 68.71 |
| 2012-04-26 | 73 | 68.452 |
| 2012-04-25 | 73 | 68.194 |
| 2012-04-24 | 74 | 68 |
| 2012-04-23 | 73 | 67.71 |
| 2012-04-20 | 72 | 67.452 |
| 2012-04-19 | 72 | 67.226 |
| 2012-04-18 | 72 | 67.032 |
| 2012-04-17 | 72 | 66.871 |
| 2012-04-16 | 72 | 66.774 |
| 2012-04-13 | 71 | 66.677 |
| 2012-04-12 | 71 | 66.613 |
| 2012-04-11 | 71 | 66.516 |
| 2012-04-10 | 71 | 66.419 |
| 2012-04-09 | 70 | 66.29 |
| 2012-04-06 | 69 | 66.194 |
| 2012-04-05 | 68 | 66.129 |
| 2012-04-04 | 69 | 66.097 |
| 2012-04-03 | 69 | 66.032 |
| 2012-04-02 | 69 | 65.968 |
| 2012-03-30 | 66 | 65.871 |
| 2012-03-29 | 63 | 65.871 |
| 2012-03-28 | 63 | 65.935 |
| 2012-03-27 | 64 | 66 |
| 2012-03-26 | 64 | 65.968 |
| 2012-03-23 | 64 | 65.935 |
| 2012-03-22 | 64 | 65.968 |
| 2012-03-21 | 64 | 66.032 |
| 2012-03-20 | 64 | 66.065 |
| 2012-03-19 | 65 | 66.161 |
| 2012-03-16 | 65 | 66.226 |
| 2012-03-15 | 65 | 66.323 |
| 2012-03-14 | 65 | 66.452 |
| 2012-03-13 | 67 | 66.548 |
| 2012-03-12 | 65 | 66.613 |
| 2012-03-09 | 65 | 66.774 |
| 2012-03-08 | 65 | 66.968 |
| 2012-03-07 | 66 | 67.161 |
| 2012-03-06 | 67 | 67.29 |
| 2012-03-05 | 69 | 67.387 |
| 2012-03-02 | 69 | 67.419 |
| 2012-03-01 | 69 | 67.548 |
| 2012-02-29 | 68 | 67.645 |
| 2012-02-28 | 68 | 67.806 |
| 2012-02-27 | 67 | 67.968 |
| 2012-02-24 | 67 | 68.226 |
| 2012-02-23 | 67 | 68.452 |
| 2012-02-22 | 67 | 68.742 |
| 2012-02-21 | 67 | 69 |
| 2012-02-17 | 67 | 69.258 |
| 2012-02-16 | 66 | 69.581 |
| 2012-02-15 | 66 | 69.903 |
| 2012-02-14 | 65 | 70.194 |
| 2012-02-13 | 65 | 70.548 |
| 2012-02-10 | 63 | 70.903 |
| 2012-02-09 | 63 | 71.323 |
| 2012-02-08 | 65 | 71.742 |
| 2012-02-07 | 66 | 72.097 |
| 2012-02-06 | 65 | 72.419 |
| 2012-02-03 | 67 | 72.742 |
| 2012-02-02 | 67 | 72.968 |
| 2012-02-01 | 68 | 73.129 |
| 2012-01-31 | 69 | 73.258 |
| 2012-01-30 | 68 | 73.355 |
| 2012-01-27 | 69 | 73.484 |
| 2012-01-26 | 70 | 73.581 |
| 2012-01-25 | 71 | 73.645 |
| 2012-01-24 | 71 | 73.71 |
| 2012-01-23 | 70 | 73.774 |
| 2012-01-20 | 70 | 73.871 |
| 2012-01-19 | 70 | 74 |
| 2012-01-18 | 73 | 74.097 |
| 2012-01-17 | 72 | 74.032 |
| 2012-01-13 | 73 | 73.935 |
| 2012-01-12 | 73 | 73.774 |
| 2012-01-11 | 75 | 73.742 |
| 2012-01-10 | 74 | 73.613 |
| 2012-01-09 | 76 | 73.548 |
| 2012-01-06 | 75 | 73.355 |
| 2012-01-05 | 75 | 73.161 |
| 2012-01-04 | 77 | 72.968 |
| 2012-01-03 | 76 | 72.645 |
| 2011-12-30 | 75 | 72.387 |
| 2011-12-29 | 76 | 72.129 |
| 2011-12-28 | 76 | 71.806 |
| 2011-12-27 | 76 | 71.484 |
| 2011-12-23 | 76 | 71.226 |
| 2011-12-22 | 76 | 70.935 |
| 2011-12-21 | 76 | 70.613 |
| 2011-12-20 | 75 | 70.323 |
| 2011-12-19 | 74 | 70.065 |
| 2011-12-16 | 72 | 69.871 |
| 2011-12-15 | 72 | 69.742 |
| 2011-12-14 | 72 | 69.548 |
| 2011-12-13 | 72 | 69.387 |
| 2011-12-12 | 72 | 69.29 |
| 2011-12-09 | 72 | 69.194 |
| 2011-12-08 | 73 | 69.161 |
| 2011-12-07 | 73 | 69.097 |
| 2011-12-06 | 73 | 69.032 |
| 2011-12-05 | 74 | 68.968 |
| 2011-12-02 | 73 | 68.935 |
| 2011-12-01 | 71 | 68.968 |
| 2011-11-30 | 69 | 69.129 |
| 2011-11-29 | 68 | 69.355 |
| 2011-11-28 | 72 | 69.645 |
| 2011-11-25 | 71 | 69.806 |
| 2011-11-23 | 72 | 69.968 |
| 2011-11-22 | 70 | 70.065 |
| 2011-11-21 | 69 | 70.194 |
| 2011-11-18 | 69 | 70.323 |
| 2011-11-17 | 67 | 70.355 |
| 2011-11-16 | 68 | 70.452 |
| 2011-11-15 | 67 | 70.484 |
| 2011-11-14 | 66 | 70.548 |
| 2011-11-10 | 66 | 70.645 |
| 2011-11-09 | 68 | 70.677 |
| 2011-11-08 | 67 | 70.613 |
| 2011-11-07 | 66 | 70.645 |
| 2011-11-04 | 67 | 70.677 |
| 2011-11-03 | 67 | 70.677 |
| 2011-11-02 | 68 | 70.645 |
| 2011-11-01 | 68 | 70.548 |
| 2011-10-31 | 66 | 70.419 |
| 2011-10-28 | 67 | 70.323 |
| 2011-10-27 | 69 | 70.097 |
| 2011-10-26 | 69 | 69.774 |
| 2011-10-25 | 71 | 69.452 |
| 2011-10-24 | 71 | 69.032 |
| 2011-10-21 | 71 | 68.516 |
| 2011-10-20 | 71 | 68.032 |
| 2011-10-19 | 73 | 67.581 |
| 2011-10-18 | 74 | 67.065 |
| 2011-10-17 | 76 | 66.484 |
| 2011-10-14 | 76 | 65.935 |
| 2011-10-13 | 77 | 65.387 |
| 2011-10-12 | 77 | 64.806 |
| 2011-10-11 | 76 | 64.226 |
| 2011-10-07 | 75 | 63.613 |
| 2011-10-06 | 74 | 63.065 |
| 2011-10-05 | 73 | 62.613 |
| 2011-10-04 | 70 | 62.097 |
| 2011-10-03 | 70 | 61.581 |
| 2011-09-30 | 69 | 61.065 |
| 2011-09-29 | 69 | 60.613 |
| 2011-09-28 | 69 | 60.129 |
| 2011-09-27 | 67 | 59.581 |
| 2011-09-26 | 66 | 59.097 |
| 2011-09-23 | 68 | 58.677 |
| 2011-09-22 | 67 | 58.161 |
| 2011-09-21 | 67 | 57.613 |
| 2011-09-20 | 66 | 57.032 |
| 2011-09-19 | 65 | 56.452 |
| 2011-09-16 | 64 | 55.903 |
| 2011-09-15 | 63 | 55.355 |
| 2011-09-14 | 60 | 54.839 |
| 2011-09-13 | 59 | 54.387 |
| 2011-09-12 | 59 | 53.935 |
| 2011-09-09 | 58 | 53.484 |
| 2011-09-08 | 55 | 53.032 |
| 2011-09-07 | 56 | 52.677 |
| 2011-09-06 | 57 | 52.258 |
| 2011-09-02 | 57 | 51.806 |
| 2011-09-01 | 56 | 51.387 |
| 2011-08-31 | 59 | 51 |
| 2011-08-30 | 59 | 50.516 |
| 2011-08-29 | 59 | 50.032 |
| 2011-08-26 | 59 | 49.516 |
| 2011-08-25 | 57 | 49 |
| 2011-08-24 | 58 | 48.548 |
| 2011-08-23 | 60 | 48.065 |
| 2011-08-22 | 57 | 47.548 |
| 2011-08-19 | 54 | 47.097 |
| 2011-08-18 | 54 | 46.742 |
| 2011-08-17 | 55 | 46.355 |
| 2011-08-16 | 54 | 45.968 |
| 2011-08-15 | 52 | 45.581 |
| 2011-08-12 | 52 | 45.226 |
| 2011-08-11 | 53 | 44.871 |
| 2011-08-10 | 52 | 44.452 |
| 2011-08-09 | 50 | 44.129 |
| 2011-08-08 | 49 | 43.839 |
| 2011-08-05 | 48 | 43.581 |
| 2011-08-04 | 48 | 43.355 |
| 2011-08-03 | 47 | 43.129 |
| 2011-08-02 | 47 | 42.935 |
| 2011-08-01 | 46 | 42.774 |
| 2011-07-29 | 45 | 42.613 |
| 2011-07-28 | 45 | 42.452 |
| 2011-07-27 | 44 | 42.323 |
| 2011-07-26 | 44 | 42.226 |
| 2011-07-25 | 43 | 42.129 |
| 2011-07-22 | 43 | 42.065 |
| 2011-07-21 | 44 | 42 |
| 2011-07-20 | 44 | 41.871 |
| 2011-07-19 | 44 | 41.774 |
| 2011-07-18 | 44 | 41.677 |
| 2011-07-15 | 43 | 41.581 |
| 2011-07-14 | 43 | 41.548 |
| 2011-07-13 | 43 | 41.484 |
| 2011-07-12 | 43 | 41.452 |
| 2011-07-11 | 44 | 41.419 |
| 2011-07-08 | 43 | 41.387 |
| 2011-07-07 | 43 | 41.387 |
| 2011-07-06 | 42 | 41.355 |
| 2011-07-05 | 43 | 41.355 |
| 2011-07-01 | 42 | 41.323 |
| 2011-06-30 | 41 | 41.323 |
| 2011-06-29 | 41 | 41.355 |
| 2011-06-28 | 40 | 41.419 |
| 2011-06-27 | 42 | 41.484 |
| 2011-06-24 | 41 | 41.516 |
| 2011-06-23 | 41 | 41.548 |
| 2011-06-22 | 41 | 41.613 |
| 2011-06-21 | 41 | 41.677 |
| 2011-06-20 | 41 | 41.71 |
| 2011-06-17 | 42 | 41.742 |
| 2011-06-16 | 41 | 41.71 |
| 2011-06-15 | 40 | 41.742 |
| 2011-06-14 | 41 | 41.774 |
| 2011-06-13 | 41 | 41.742 |
| 2011-06-10 | 41 | 41.774 |
| 2011-06-09 | 41 | 41.774 |
| 2011-06-08 | 41 | 41.806 |
| 2011-06-07 | 40 | 41.839 |
| 2011-06-06 | 41 | 41.903 |
| 2011-06-03 | 41 | 42 |
| 2011-06-02 | 41 | 42.065 |
| 2011-06-01 | 42 | 42.129 |
| 2011-05-31 | 41 | 42.161 |
| 2011-05-27 | 42 | 42.226 |
| 2011-05-26 | 42 | 42.258 |
| 2011-05-25 | 43 | 42.29 |
| 2011-05-24 | 43 | 42.29 |
| 2011-05-23 | 42 | 42.29 |
| 2011-05-20 | 42 | 42.355 |
| 2011-05-19 | 42 | 42.387 |
| 2011-05-18 | 42 | 42.419 |
| 2011-05-17 | 42 | 42.484 |
| 2011-05-16 | 43 | 42.516 |
| 2011-05-13 | 42 | 42.484 |
| 2011-05-12 | 43 | 42.452 |
| 2011-05-11 | 42 | 42.387 |
| 2011-05-10 | 43 | 42.355 |
| 2011-05-09 | 43 | 42.29 |
| 2011-05-06 | 42 | 42.258 |
| 2011-05-05 | 42 | 42.258 |
| 2011-05-04 | 41 | 42.226 |
| 2011-05-03 | 42 | 42.194 |
| 2011-05-02 | 41 | 42.161 |
| 2011-04-29 | 40 | 42.161 |
| 2011-04-28 | 42 | 42.161 |
| 2011-04-27 | 41 | 42.129 |
| 2011-04-26 | 42 | 42.065 |
| 2011-04-25 | 42 | 41.968 |
| 2011-04-21 | 42 | 41.903 |
| 2011-04-20 | 44 | 41.806 |
| 2011-04-19 | 43 | 41.71 |
| 2011-04-18 | 43 | 41.645 |
| 2011-04-15 | 43 | 41.548 |
| 2011-04-14 | 43 | 41.484 |
| 2011-04-13 | 43 | 41.387 |
| 2011-04-12 | 43 | 41.323 |
| 2011-04-11 | 43 | 41.258 |
| 2011-04-08 | 43 | 41.194 |
| 2011-04-07 | 44 | 41.161 |
| 2011-04-06 | 43 | 41.097 |
| 2011-04-05 | 43 | 41.065 |
| 2011-04-04 | 44 | 41.032 |
| 2011-04-01 | 43 | 40.968 |
| 2011-03-31 | 42 | 40.903 |
| 2011-03-30 | 41 | 40.903 |
| 2011-03-29 | 41 | 40.968 |
| 2011-03-28 | 41 | 41 |
| 2011-03-25 | 41 | 41 |
| 2011-03-24 | 42 | 41.065 |
| 2011-03-23 | 42 | 41.097 |
| 2011-03-22 | 41 | 41.129 |
| 2011-03-21 | 40 | 41.226 |
| 2011-03-18 | 41 | 41.355 |
| 2011-03-17 | 41 | 41.484 |
| 2011-03-16 | 40 | 41.613 |
| 2011-03-15 | 41 | 41.742 |
| 2011-03-14 | 39 | 41.871 |
| 2011-03-11 | 39 | 42.097 |
| 2011-03-10 | 40 | 42.323 |
| 2011-03-09 | 39 | 42.581 |
| 2011-03-08 | 41 | 42.871 |
| 2011-03-07 | 41 | 43.129 |
| 2011-03-04 | 40 | 43.387 |
| 2011-03-03 | 41 | 43.645 |
| 2011-03-02 | 40 | 43.903 |
| 2011-03-01 | 41 | 44.226 |
| 2011-02-28 | 41 | 44.516 |
| 2011-02-25 | 41 | 44.806 |
| 2011-02-24 | 42 | 45.097 |
| 2011-02-23 | 42 | 45.355 |
| 2011-02-22 | 42 | 45.613 |
| 2011-02-18 | 42 | 45.871 |
| 2011-02-17 | 42 | 46.194 |
| 2011-02-16 | 41 | 46.516 |
| 2011-02-15 | 42 | 46.839 |
| 2011-02-14 | 43 | 47.032 |
| 2011-02-11 | 42 | 47.194 |
| 2011-02-10 | 41 | 47.387 |
| 2011-02-09 | 43 | 47.613 |
| 2011-02-08 | 43 | 47.774 |
| 2011-02-07 | 43 | 47.935 |
| 2011-02-04 | 44 | 48.097 |
| 2011-02-03 | 44 | 48.194 |
| 2011-02-02 | 45 | 48.323 |
| 2011-02-01 | 45 | 48.387 |
| 2011-01-31 | 44 | 48.484 |
| 2011-01-28 | 45 | 48.613 |
| 2011-01-27 | 46 | 48.71 |
| 2011-01-26 | 46 | 48.742 |
| 2011-01-25 | 48 | 48.774 |
| 2011-01-24 | 48 | 48.742 |
| 2011-01-21 | 49 | 48.774 |
| 2011-01-20 | 49 | 48.742 |
| 2011-01-19 | 48 | 48.677 |
| 2011-01-18 | 49 | 48.677 |
| 2011-01-14 | 50 | 48.613 |
| 2011-01-13 | 50 | 48.548 |
| 2011-01-12 | 50 | 48.452 |
| 2011-01-11 | 50 | 48.323 |
| 2011-01-10 | 50 | 48.258 |
| 2011-01-07 | 50 | 48.194 |
| 2011-01-06 | 50 | 48.097 |
| 2011-01-05 | 52 | 48.032 |
| 2011-01-04 | 52 | 47.935 |
| 2011-01-03 | 51 | 47.806 |